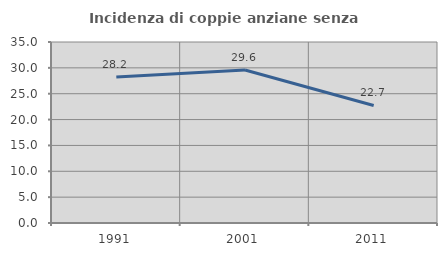
| Category | Incidenza di coppie anziane senza figli  |
|---|---|
| 1991.0 | 28.244 |
| 2001.0 | 29.577 |
| 2011.0 | 22.727 |